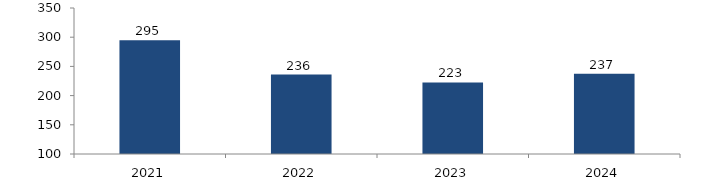
| Category | Bogotá |
|---|---|
| 2021.0 | 294.95 |
| 2022.0 | 236.1 |
| 2023.0 | 222.539 |
| 2024.0 | 237.251 |